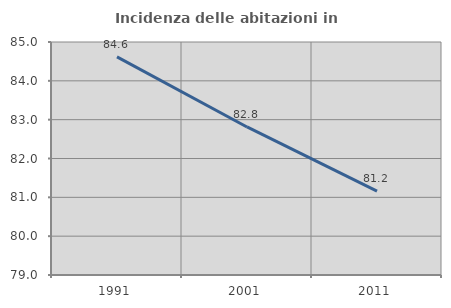
| Category | Incidenza delle abitazioni in proprietà  |
|---|---|
| 1991.0 | 84.615 |
| 2001.0 | 82.812 |
| 2011.0 | 81.159 |